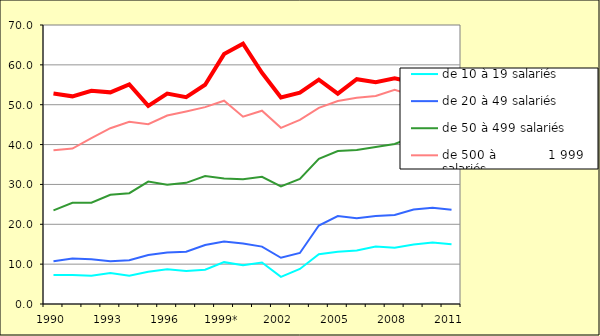
| Category | de 10 à 19 salariés | de 20 à 49 salariés | de 50 à 499 salariés | de 500 à             1 999 salariés | 2 000 salariés ou plus |
|---|---|---|---|---|---|
| 1990 | 7.3 | 10.7 | 23.5 | 38.6 | 52.8 |
| 1991 | 7.3 | 11.4 | 25.4 | 39 | 52.1 |
| 1992 | 7.1 | 11.2 | 25.4 | 41.6 | 53.5 |
| 1993 | 7.8 | 10.7 | 27.4 | 44.1 | 53.1 |
| 1994 | 7.1 | 11 | 27.8 | 45.7 | 55.1 |
| 1995 | 8.1 | 12.3 | 30.7 | 45.1 | 49.7 |
| 1996 | 8.7 | 12.9 | 29.9 | 47.3 | 52.8 |
| 1997 | 8.3 | 13.1 | 30.4 | 48.3 | 51.9 |
| 1998 | 8.6 | 14.8 | 32.1 | 49.4 | 55 |
| 1999* | 10.5 | 15.7 | 31.5 | 51 | 62.7 |
| 2000 | 9.7 | 15.2 | 31.3 | 47 | 65.3 |
| 2001 | 10.4 | 14.4 | 31.9 | 48.5 | 58 |
| 2002 | 6.8 | 11.6 | 29.5 | 44.2 | 51.8 |
| 2003 | 8.8 | 12.8 | 31.4 | 46.2 | 53 |
| 2004 | 12.5 | 19.7 | 36.4 | 49.2 | 56.3 |
| 2005 | 13.126 | 22.073 | 38.39 | 50.926 | 52.78 |
| 2006 | 13.442 | 21.546 | 38.628 | 51.72 | 56.411 |
| 2007 | 14.416 | 22.051 | 39.367 | 52.206 | 55.629 |
| 2008 | 14.087 | 22.341 | 40.155 | 53.736 | 56.643 |
| 2009 | 14.953 | 23.696 | 41.969 | 52.259 | 55.581 |
| 2010 | 15.409 | 24.158 | 41.863 | 54.243 | 52.997 |
| 2011 | 15.005 | 23.622 | 42.195 | 54.882 | 57.55 |